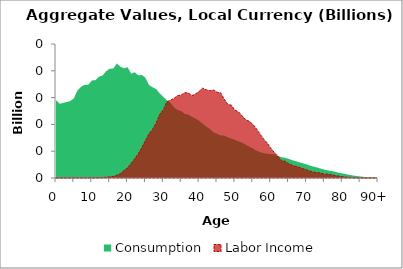
| Category | Consumption | Labor Income |
|---|---|---|
| 0 | 145.129 | 0 |
|  | 138.502 | 0 |
| 2 | 140.1 | 0.01 |
| 3 | 141.745 | 0.035 |
| 4 | 143.549 | 0.045 |
| 5 | 148.783 | 0.061 |
| 6 | 163.368 | 0.124 |
| 7 | 170.235 | 0.196 |
| 8 | 173.986 | 0.334 |
| 9 | 173.821 | 0.393 |
| 10 | 181.991 | 0.509 |
| 11 | 182.414 | 0.527 |
| 12 | 188.981 | 0.714 |
| 13 | 191.294 | 0.872 |
| 14 | 199.05 | 1.27 |
| 15 | 204.04 | 2.212 |
| 16 | 204.067 | 2.868 |
| 17 | 213.693 | 5.105 |
| 18 | 207.618 | 8.231 |
| 19 | 204.773 | 13.94 |
| 20 | 206.638 | 18.814 |
| 21 | 194.618 | 27.379 |
| 22 | 197.189 | 35.685 |
| 23 | 191.479 | 45.107 |
| 24 | 192.251 | 56.974 |
| 25 | 186.95 | 69.628 |
| 26 | 173.645 | 82.569 |
| 27 | 169.193 | 90.623 |
| 28 | 165.824 | 102.785 |
| 29 | 157.598 | 118.728 |
| 30 | 151.251 | 127.303 |
| 31 | 145.045 | 142.234 |
| 32 | 140.391 | 145.207 |
| 33 | 131.563 | 148.586 |
| 34 | 127.073 | 153.769 |
| 35 | 124.85 | 154.861 |
| 36 | 119.548 | 159.06 |
| 37 | 118.138 | 158.59 |
| 38 | 113.964 | 153.563 |
| 39 | 110.847 | 156.845 |
| 40 | 106.836 | 161.558 |
| 41 | 101.392 | 167.609 |
| 42 | 96.173 | 164.579 |
| 43 | 91.414 | 162.804 |
| 44 | 85.195 | 164.17 |
| 45 | 82.58 | 159.851 |
| 46 | 79.382 | 158.976 |
| 47 | 79.285 | 147.225 |
| 48 | 75.975 | 137.55 |
| 49 | 73.552 | 135.885 |
| 50 | 71.096 | 126.564 |
| 51 | 68.383 | 123.501 |
| 52 | 65.947 | 116.164 |
| 53 | 62.234 | 108.43 |
| 54 | 58.571 | 105.869 |
| 55 | 55.348 | 100.154 |
| 56 | 50.9 | 92.055 |
| 57 | 48.301 | 82.145 |
| 58 | 46.435 | 72.71 |
| 59 | 45.563 | 65.712 |
| 60 | 44.441 | 55.701 |
| 61 | 43.931 | 47.696 |
| 62 | 41.212 | 40.565 |
| 63 | 39.011 | 32.051 |
| 64 | 37.801 | 31.616 |
| 65 | 35.823 | 26.723 |
| 66 | 33.232 | 23.7 |
| 67 | 31.432 | 21.573 |
| 68 | 29.276 | 19.957 |
| 69 | 27.508 | 17.414 |
| 70 | 25.447 | 15.639 |
| 71 | 23.144 | 12.788 |
| 72 | 21.315 | 11.069 |
| 73 | 19.471 | 10.089 |
| 74 | 17.455 | 9.116 |
| 75 | 15.623 | 7.168 |
| 76 | 14.022 | 7.095 |
| 77 | 13.212 | 5.908 |
| 78 | 11.589 | 4.413 |
| 79 | 9.893 | 3.641 |
| 80 | 8.673 | 2.545 |
| 81 | 7.184 | 1.673 |
| 82 | 5.836 | 1.355 |
| 83 | 4.644 | 0.519 |
| 84 | 3.747 | 0.252 |
| 85 | 2.863 | 0.156 |
| 86 | 2.124 | 0.082 |
| 87 | 1.551 | 0.065 |
| 88 | 1.121 | 0.039 |
| 89 | 0.81 | 0.008 |
| 90+ | 1.647 | 0.016 |